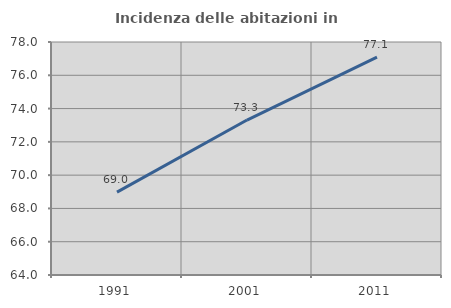
| Category | Incidenza delle abitazioni in proprietà  |
|---|---|
| 1991.0 | 68.983 |
| 2001.0 | 73.311 |
| 2011.0 | 77.092 |